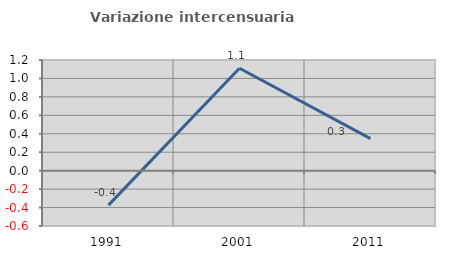
| Category | Variazione intercensuaria annua |
|---|---|
| 1991.0 | -0.374 |
| 2001.0 | 1.111 |
| 2011.0 | 0.347 |